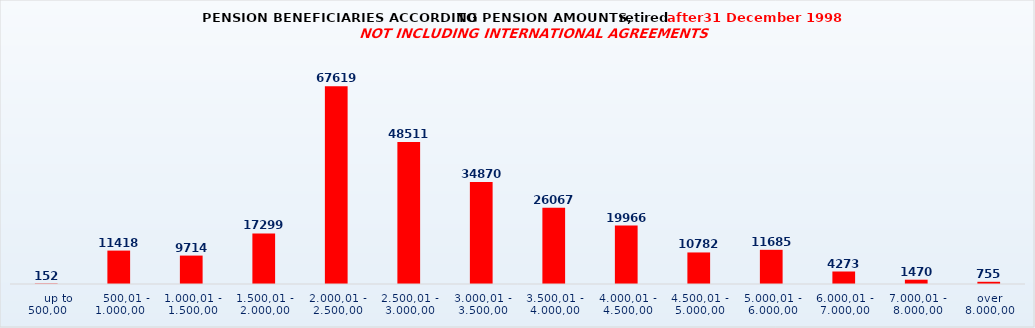
| Category | Series 0 |
|---|---|
|      up to 500,00 | 152 |
|    500,01 - 1.000,00 | 11418 |
| 1.000,01 - 1.500,00 | 9714 |
| 1.500,01 - 2.000,00 | 17299 |
| 2.000,01 - 2.500,00 | 67619 |
| 2.500,01 - 3.000,00 | 48511 |
| 3.000,01 - 3.500,00 | 34870 |
| 3.500,01 - 4.000,00 | 26067 |
| 4.000,01 - 4.500,00 | 19966 |
| 4.500,01 - 5.000,00 | 10782 |
| 5.000,01 - 6.000,00 | 11685 |
| 6.000,01 - 7.000,00 | 4273 |
| 7.000,01 - 8.000,00 | 1470 |
| over 8.000,00 | 755 |